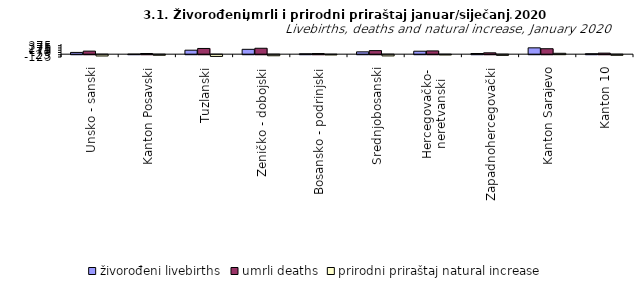
| Category | živorođeni livebirths | umrli deaths | prirodni priraštaj natural increase |
|---|---|---|---|
| Unsko - sanski | 78 | 135 | -57 |
| Kanton Posavski | 3 | 29 | -26 |
| Tuzlanski | 176 | 253 | -77 |
| Zeničko - dobojski | 215 | 262 | -47 |
| Bosansko - podrinjski | 16 | 27 | -11 |
| Srednjobosanski | 103 | 157 | -54 |
| Hercegovačko-
neretvanski | 131 | 144 | -13 |
| Zapadnohercegovački | 29 | 60 | -31 |
| Kanton Sarajevo | 280 | 241 | 39 |
| Kanton 10 | 19 | 46 | -27 |